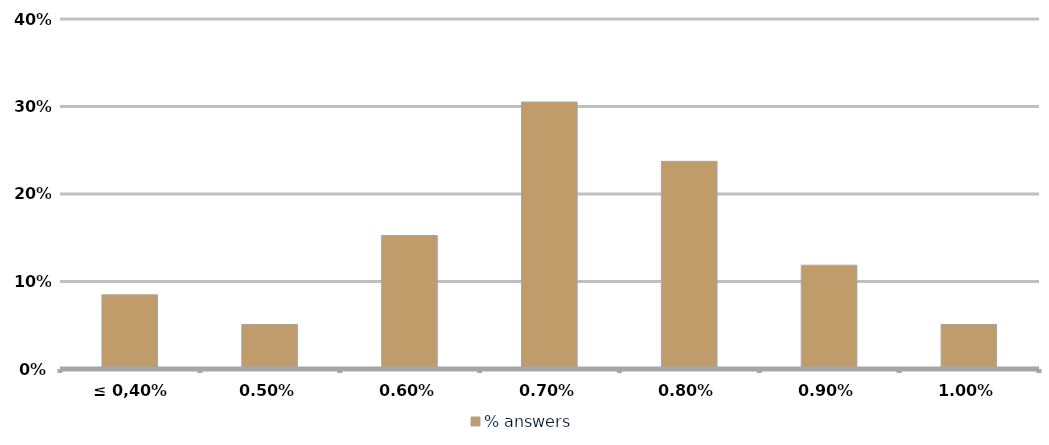
| Category | % answers |
|---|---|
| ≤ 0,40% | 0.085 |
| 0,50% | 0.051 |
| 0,60% | 0.153 |
| 0,70% | 0.305 |
| 0,80% | 0.237 |
| 0,90% | 0.119 |
| 1,00% | 0.051 |